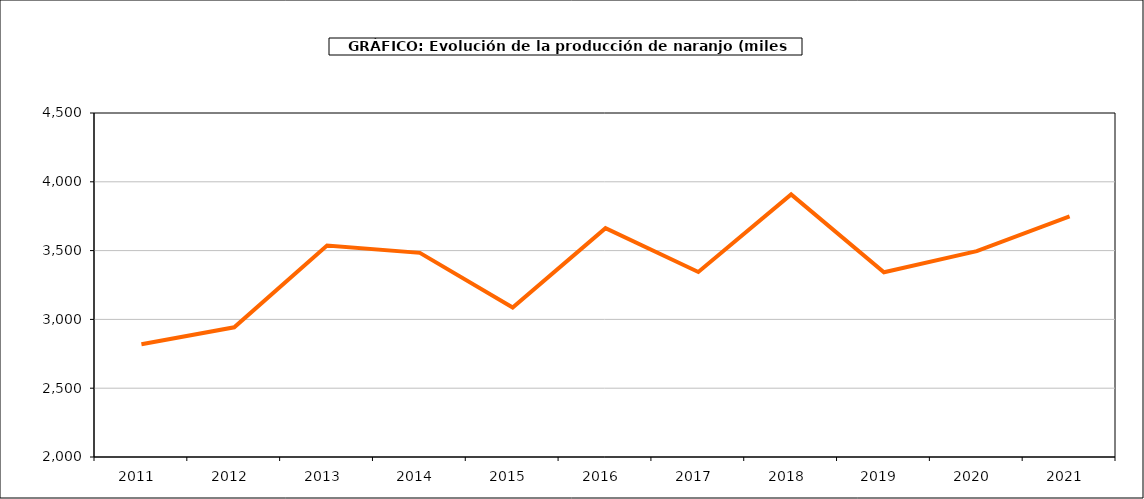
| Category | producción |
|---|---|
| 2011.0 | 2818.888 |
| 2012.0 | 2942.28 |
| 2013.0 | 3536.745 |
| 2014.0 | 3483.503 |
| 2015.0 | 3086.849 |
| 2016.0 | 3662.718 |
| 2017.0 | 3344.428 |
| 2018.0 | 3908.749 |
| 2019.0 | 3342.54 |
| 2020.0 | 3496.145 |
| 2021.0 | 3749.026 |